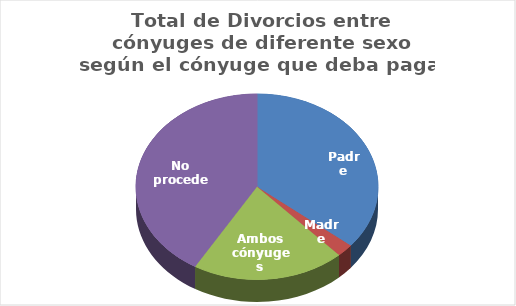
| Category | Series 0 |
|---|---|
| Padre | 27336 |
| Madre | 1703 |
| Ambos cónyuges | 15498 |
| No procede | 31568 |